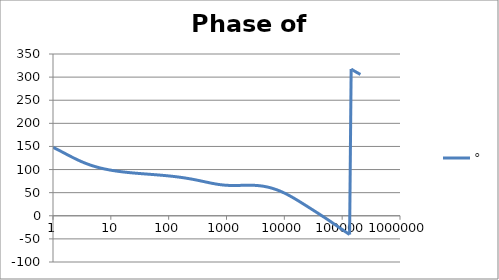
| Category | ° |
|---|---|
| 1.0 | 148.04 |
| 1.0634378492473788 | 146.435 |
| 1.1309000592118907 | 144.791 |
| 1.2026419266820265 | 143.112 |
| 1.278934943925458 | 141.404 |
| 1.3600678260954062 | 139.671 |
| 1.4463476038134566 | 137.922 |
| 1.5381007850634825 | 136.16 |
| 1.6356745907936145 | 134.394 |
| 1.739438268902148 | 132.63 |
| 1.849784491579884 | 130.873 |
| 1.967130841296868 | 129.132 |
| 2.091921391056928 | 127.411 |
| 2.2246283849001642 | 125.717 |
| 2.365754025012901 | 124.055 |
| 2.5158323722080485 | 122.43 |
| 2.6754313669678584 | 120.845 |
| 2.8451549786972743 | 119.305 |
| 3.025645491321301 | 117.813 |
| 3.2175859338757533 | 116.37 |
| 3.42170266528945 | 114.978 |
| 3.6387681231394358 | 113.639 |
| 3.8696037467813236 | 112.354 |
| 4.115083085916729 | 111.122 |
| 4.376135106361553 | 109.943 |
| 4.653747705525078 | 108.817 |
| 4.948971450903514 | 107.742 |
| 5.262923555735513 | 106.718 |
| 5.596792106864742 | 105.744 |
| 5.951840560808945 | 104.817 |
| 6.329412525049976 | 103.936 |
| 6.730936842638569 | 103.099 |
| 7.157932999355504 | 102.305 |
| 7.612016873891456 | 101.552 |
| 8.094906852805886 | 100.837 |
| 8.608430333405762 | 100.159 |
| 9.154530639152917 | 99.516 |
| 9.735274373770007 | 98.906 |
| 10.352859241875105 | 98.327 |
| 11.009622365740512 | 97.777 |
| 11.708049129648925 | 97.255 |
| 12.4507825853165 | 96.76 |
| 13.240633453975693 | 96.288 |
| 14.080590762968805 | 95.84 |
| 14.973833157104059 | 95.412 |
| 15.923740927579823 | 95.005 |
| 16.93390880399795 | 94.616 |
| 18.008159557874837 | 94.243 |
| 19.150558469130036 | 93.887 |
| 20.365428710297824 | 93.545 |
| 21.65736770667993 | 93.216 |
| 23.031264534351347 | 92.899 |
| 24.492318421858034 | 92.593 |
| 26.046058425622668 | 92.296 |
| 27.698364353515743 | 92.008 |
| 29.45548901577305 | 91.728 |
| 31.32408188746347 | 91.454 |
| 33.311214272052936 | 91.185 |
| 35.42440606129053 | 90.921 |
| 37.67165419268462 | 90.661 |
| 40.06146291225952 | 90.403 |
| 42.60287595711691 | 90.146 |
| 45.30551077958928 | 89.891 |
| 48.17959494250036 | 89.635 |
| 51.23600482326248 | 89.377 |
| 54.486306773278585 | 89.118 |
| 57.94280088840825 | 88.855 |
| 61.61856755613799 | 88.589 |
| 65.52751695560372 | 88.317 |
| 69.68444169778837 | 88.04 |
| 74.10507280510043 | 87.756 |
| 78.80613924217637 | 87.464 |
| 83.8054312231895 | 87.163 |
| 89.12186753523771 | 86.852 |
| 94.77556713258299 | 86.531 |
| 100.78792527267464 | 86.197 |
| 107.18169448207877 | 85.851 |
| 113.98107065871142 | 85.491 |
| 121.21178463621371 | 85.117 |
| 128.90119955697148 | 84.727 |
| 137.07841442227294 | 84.32 |
| 145.77437421146283 | 83.895 |
| 155.02198698682062 | 83.452 |
| 164.85624842731968 | 82.99 |
| 175.3143742625403 | 82.508 |
| 186.43594110790573 | 82.006 |
| 198.26303623420247 | 81.482 |
| 210.84041683815525 | 80.937 |
| 224.21567941678887 | 80.371 |
| 238.43943988652958 | 79.784 |
| 253.56552512868072 | 79.176 |
| 269.65117668612646 | 78.547 |
| 286.75726738211927 | 77.899 |
| 304.9485316808965 | 77.234 |
| 324.2938106618788 | 76.553 |
| 344.8663125345048 | 75.858 |
| 366.7438896795682 | 75.152 |
| 390.00933326545766 | 74.439 |
| 414.7506865542229 | 73.722 |
| 441.06157808309626 | 73.005 |
| 469.0415759823428 | 72.294 |
| 498.7965647702637 | 71.594 |
| 530.4391460512702 | 70.909 |
| 564.089064633379 | 70.245 |
| 599.8736616776864 | 69.608 |
| 637.9283565946681 | 69.004 |
| 678.3971595109495 | 68.438 |
| 721.4332162458546 | 67.914 |
| 767.1993878601115 | 67.438 |
| 815.868866969862 | 67.013 |
| 867.6258331583267 | 66.64 |
| 922.6661499653554 | 66.323 |
| 981.1981060925172 | 66.061 |
| 1043.443203628628 | 65.855 |
| 1109.6369962786232 | 65.701 |
| 1180.0299807678607 | 65.597 |
| 1254.8885447951977 | 65.54 |
| 1334.4959751221782 | 65.523 |
| 1419.1535296132129 | 65.542 |
| 1509.1815772837017 | 65.589 |
| 1604.9208106703452 | 65.658 |
| 1706.7335351116335 | 65.741 |
| 1815.0050398174897 | 65.831 |
| 1930.1450559166665 | 65.919 |
| 2052.58930699948 | 65.999 |
| 2182.801158023697 | 66.062 |
| 2321.2733688234066 | 66.102 |
| 2468.5299588567814 | 66.112 |
| 2625.128190249376 | 66.085 |
| 2791.6606766374607 | 66.016 |
| 2968.757625791824 | 65.9 |
| 3157.08922450881 | 65.731 |
| 3357.3681747937244 | 65.504 |
| 3570.352390934236 | 65.217 |
| 3796.8478676703417 | 64.864 |
| 4037.7117303148448 | 64.443 |
| 4293.8554783669315 | 63.951 |
| 4566.248434893605 | 63.385 |
| 4855.9214147324665 | 62.744 |
| 5163.970625397384 | 62.024 |
| 5491.561815449236 | 61.225 |
| 5839.934686030357 | 60.345 |
| 6210.40758225729 | 59.383 |
| 6604.382482225307 | 58.339 |
| 7023.350302504747 | 57.213 |
| 7468.896540206577 | 56.005 |
| 7942.707272968458 | 54.717 |
| 8446.575539567106 | 53.349 |
| 8982.408125302747 | 51.903 |
| 9552.232777834151 | 50.382 |
| 10158.205880770249 | 48.789 |
| 10802.620614058389 | 47.128 |
| 11487.915632049675 | 45.402 |
| 12216.684292082227 | 43.617 |
| 12991.684468506162 | 41.776 |
| 13815.848989288772 | 39.886 |
| 14692.296734695852 | 37.951 |
| 15624.344440049217 | 35.978 |
| 16615.519247226184 | 33.971 |
| 17669.572052398642 | 31.937 |
| 18790.49170052441 | 29.88 |
| 19982.5200803064 | 27.804 |
| 21250.168176743602 | 25.715 |
| 22598.233142021272 | 23.614 |
| 24031.816449341983 | 21.506 |
| 25556.34319839602 | 19.393 |
| 27177.582645530147 | 17.274 |
| 28901.67003630542 | 15.152 |
| 30735.129823066054 | 13.027 |
| 32684.900355380338 | 10.897 |
| 34758.3601367905 | 8.762 |
| 36963.35574723439 | 6.621 |
| 39308.23153680468 | 4.471 |
| 41801.861203217486 | 2.311 |
| 44453.68137248706 | 0.139 |
| 47273.727309885995 | -2.047 |
| 50272.670896332245 | -4.248 |
| 53461.86101391677 | -6.466 |
| 56853.36649340195 | -8.7 |
| 60460.02178621637 | -10.951 |
| 64295.47553378361 | -13.218 |
| 68374.24221798431 | -15.5 |
| 72711.75708821259 | -17.794 |
| 77324.43457288652 | -20.098 |
| 82229.73039646025 | -22.407 |
| 87446.2076370035 | -24.718 |
| 92993.60697433475 | -27.026 |
| 98892.92139454243 | -29.324 |
| 105166.47563360249 | -31.608 |
| 111838.01066072512 | -33.871 |
| 118932.77352114675 | -36.108 |
| 126477.61287835392 | -38.311 |
| 134501.0806172993 | -40.475 |
| 143033.53989310883 | 317.407 |
| 152107.28003416685 | 315.338 |
| 161756.63873440344 | 313.325 |
| 172018.1319971993 | 311.373 |
| 182930.592322653 | 309.483 |
| 194535.31566115122 | 307.661 |
| 206876.217689355 | 305.907 |